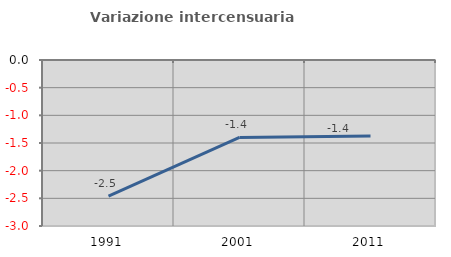
| Category | Variazione intercensuaria annua |
|---|---|
| 1991.0 | -2.46 |
| 2001.0 | -1.399 |
| 2011.0 | -1.373 |